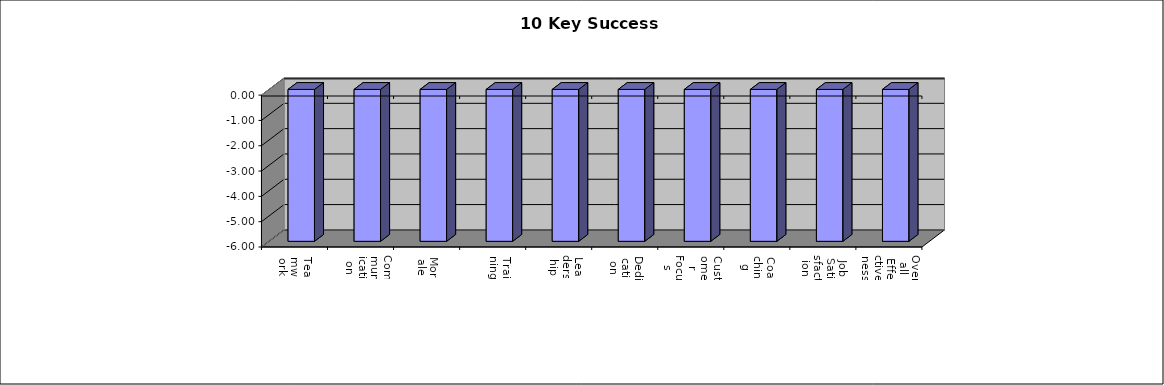
| Category | Series 0 |
|---|---|
| Teamwork | -6 |
| Communication | -6 |
| Morale | -6 |
| Training | -6 |
| Leadership | -6 |
| Dedication | -6 |
| Customer Focus | -6 |
| Coaching | -6 |
| Job Satisfaction | -6 |
| Overall Effectiveness | -6 |